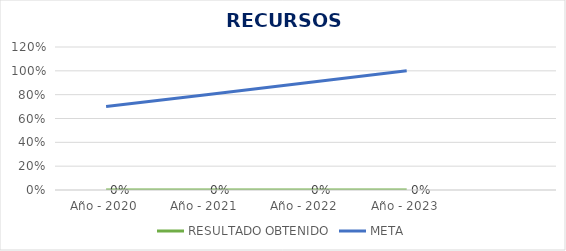
| Category | RESULTADO OBTENIDO | META |
|---|---|---|
| Año - 2020 | 0 | 0.7 |
| Año - 2021 | 0 | 0.8 |
| Año - 2022 | 0 | 0.9 |
| Año - 2023 | 0 | 1 |